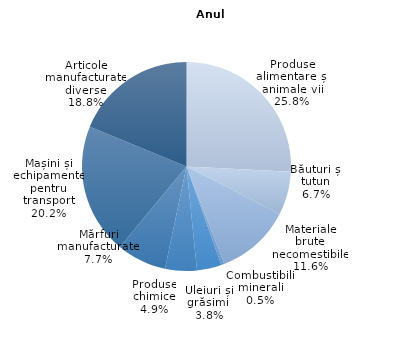
| Category | % |
|---|---|
| Produse alimentare și animale vii | 25.8 |
| Băuturi și tutun | 6.7 |
| Materiale brute necomestibile | 11.6 |
| Combustibili minerali | 0.5 |
| Uleiuri și grăsimi  | 3.8 |
| Produse chimice | 4.9 |
| Mărfuri manufacturate  | 7.7 |
| Mașini și echipamente pentru transport | 20.2 |
| Articole manufacturate diverse | 18.8 |